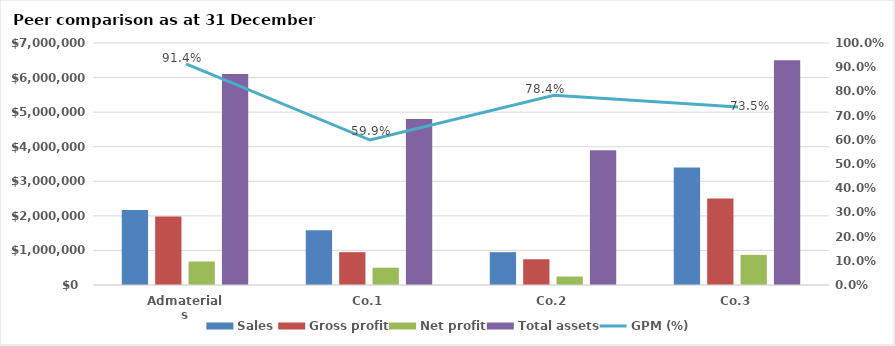
| Category | Sales | Gross profit | Net profit | Total assets |
|---|---|---|---|---|
| Admaterials | 2168000 | 1981950 | 680000 | 6100000 |
| Co.1 | 1586000 | 950000 | 500000 | 4800000 |
| Co.2 | 950000 | 745000 | 245000 | 3900000 |
| Co.3 | 3400000 | 2500000 | 870000 | 6500000 |